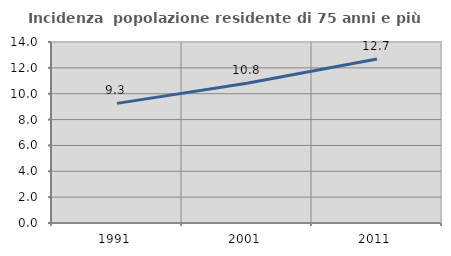
| Category | Incidenza  popolazione residente di 75 anni e più |
|---|---|
| 1991.0 | 9.252 |
| 2001.0 | 10.814 |
| 2011.0 | 12.684 |